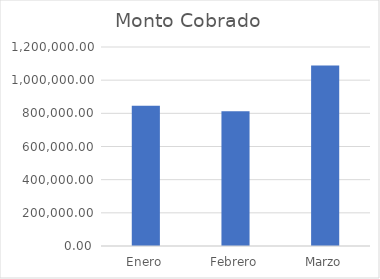
| Category | Monto Cobrado |
|---|---|
| Enero | 845764 |
| Febrero | 812064.3 |
| Marzo | 1088447 |